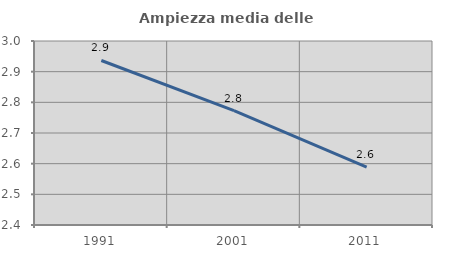
| Category | Ampiezza media delle famiglie |
|---|---|
| 1991.0 | 2.936 |
| 2001.0 | 2.773 |
| 2011.0 | 2.588 |